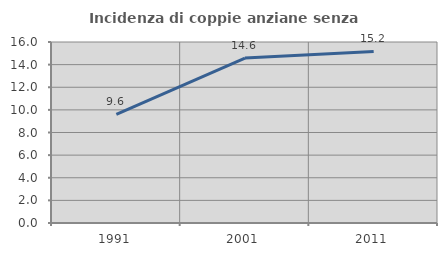
| Category | Incidenza di coppie anziane senza figli  |
|---|---|
| 1991.0 | 9.596 |
| 2001.0 | 14.583 |
| 2011.0 | 15.169 |